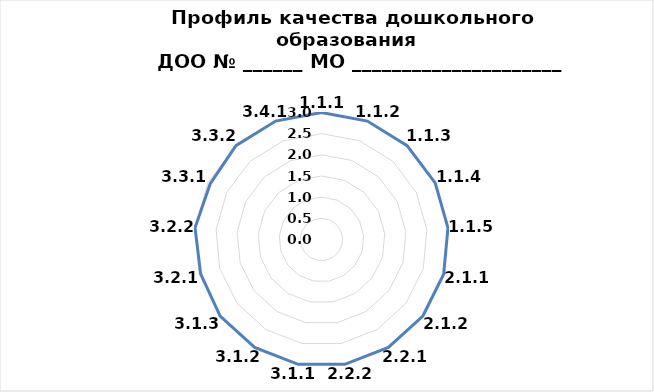
| Category | Series 0 |
|---|---|
| 1.1.1 | 3 |
| 1.1.2 | 3 |
| 1.1.3 | 3 |
| 1.1.4 | 3 |
| 1.1.5 | 3 |
| 2.1.1 | 3 |
| 2.1.2 | 3 |
| 2.2.1 | 3 |
| 2.2.2 | 3 |
| 3.1.1 | 3 |
| 3.1.2 | 3 |
| 3.1.3 | 3 |
| 3.2.1 | 2.968 |
| 3.2.2 | 3 |
| 3.3.1 | 2.939 |
| 3.3.2 | 3 |
| 3.4.1 | 3 |